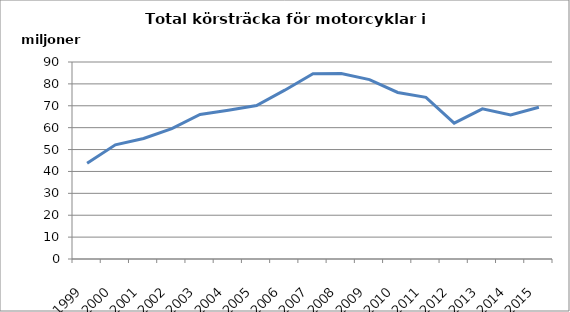
| Category | Series 0 |
|---|---|
| 1999.0 | 43759018.5 |
| 2000.0 | 52181330.9 |
| 2001.0 | 55070560.3 |
| 2002.0 | 59563146.5 |
| 2003.0 | 66034252.2 |
| 2004.0 | 67970980.7 |
| 2005.0 | 70113208.5 |
| 2006.0 | 77125282 |
| 2007.0 | 84622120.1 |
| 2008.0 | 84732017.6 |
| 2009.0 | 81950964.8 |
| 2010.0 | 76081708.7 |
| 2011.0 | 73838792.3 |
| 2012.0 | 62082106 |
| 2013.0 | 68600869.7 |
| 2014.0 | 65803999 |
| 2015.0 | 69320703 |